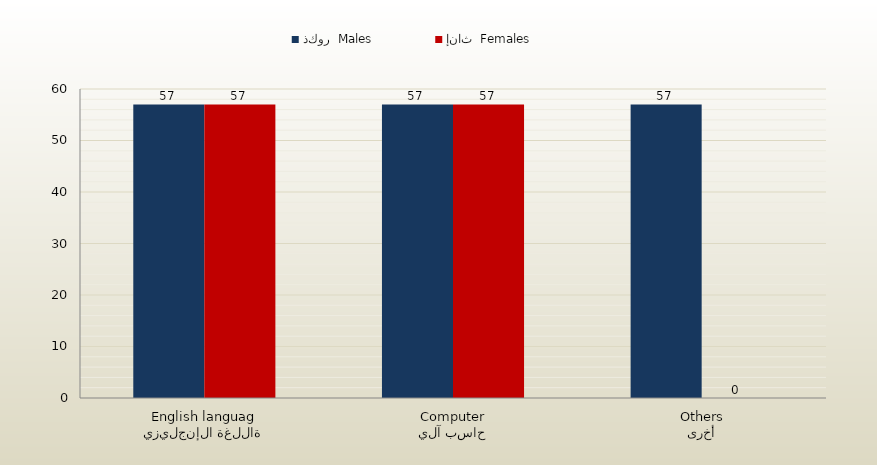
| Category | ذكور  Males | إناث  Females |
|---|---|---|
| اللغة الإنجليزية
English language | 57 | 57 |
| حاسب آلي
Computer | 57 | 57 |
| أخرى
Others | 57 | 0 |